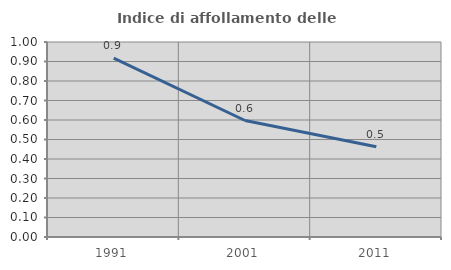
| Category | Indice di affollamento delle abitazioni  |
|---|---|
| 1991.0 | 0.917 |
| 2001.0 | 0.597 |
| 2011.0 | 0.463 |